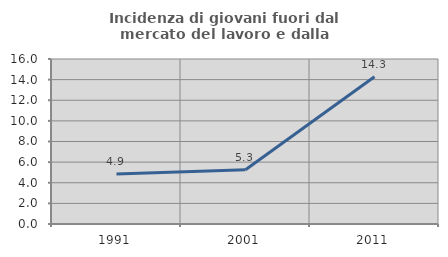
| Category | Incidenza di giovani fuori dal mercato del lavoro e dalla formazione  |
|---|---|
| 1991.0 | 4.854 |
| 2001.0 | 5.263 |
| 2011.0 | 14.286 |